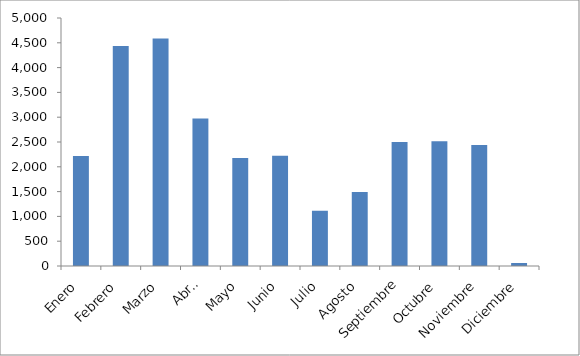
| Category | Series 0 |
|---|---|
| Enero | 2220 |
| Febrero | 4438 |
| Marzo | 4585 |
| Abril | 2972 |
| Mayo | 2177 |
| Junio | 2221 |
| Julio | 1114 |
| Agosto | 1494 |
| Septiembre | 2502 |
| Octubre | 2514 |
| Noviembre | 2440 |
| Diciembre | 60 |